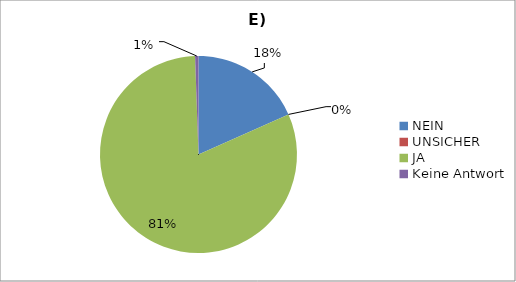
| Category | Series 0 |
|---|---|
| NEIN | 33 |
| UNSICHER | 0 |
| JA | 146 |
| Keine Antwort | 1 |